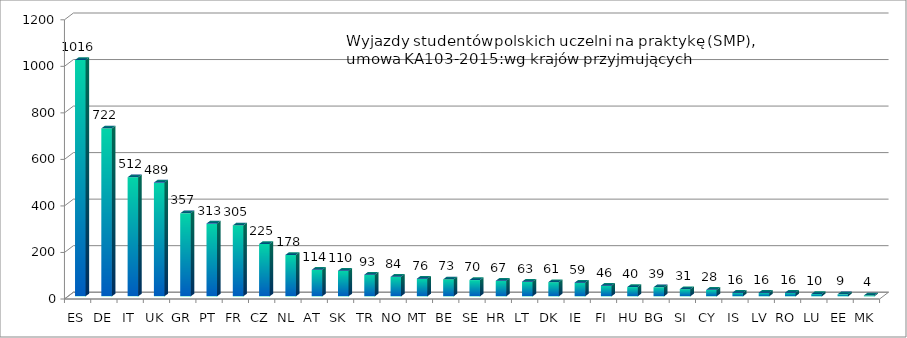
| Category | Series 0 |
|---|---|
| ES | 1016 |
| DE | 722 |
| IT | 512 |
| UK | 489 |
| GR | 357 |
| PT | 313 |
| FR | 305 |
| CZ | 225 |
| NL | 178 |
| AT | 114 |
| SK | 110 |
| TR | 93 |
| NO | 84 |
| MT | 76 |
| BE | 73 |
| SE | 70 |
| HR | 67 |
| LT | 63 |
| DK | 61 |
| IE | 59 |
| FI | 46 |
| HU | 40 |
| BG | 39 |
| SI | 31 |
| CY | 28 |
| IS | 16 |
| LV | 16 |
| RO | 16 |
| LU | 10 |
| EE | 9 |
| MK | 4 |